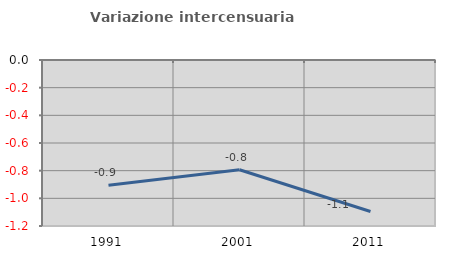
| Category | Variazione intercensuaria annua |
|---|---|
| 1991.0 | -0.905 |
| 2001.0 | -0.794 |
| 2011.0 | -1.095 |